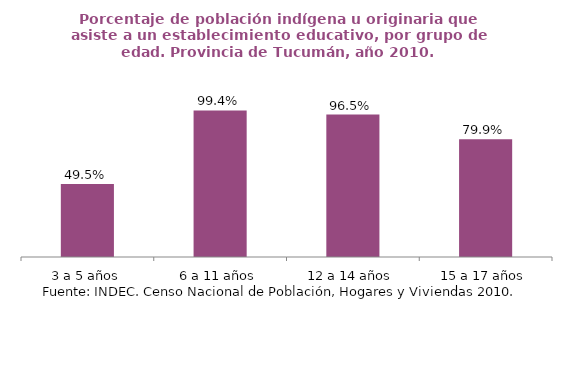
| Category | Series 0 |
|---|---|
| 3 a 5 años | 0.495 |
| 6 a 11 años | 0.994 |
| 12 a 14 años | 0.965 |
| 15 a 17 años | 0.799 |